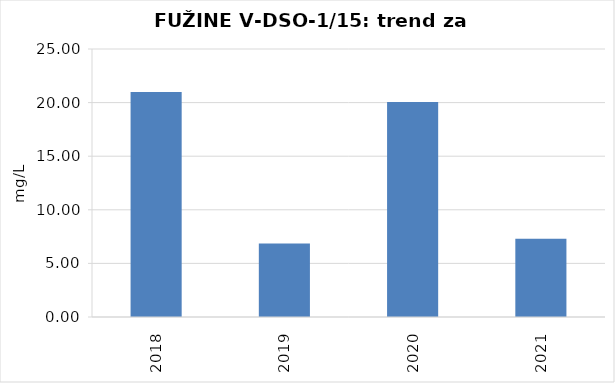
| Category | Vsota |
|---|---|
| 2018 | 21 |
| 2019 | 6.85 |
| 2020 | 20.05 |
| 2021 | 7.3 |